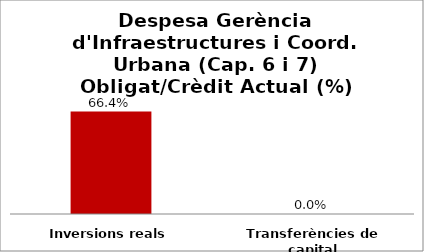
| Category | Series 0 |
|---|---|
| Inversions reals | 0.664 |
| Transferències de capital | 0 |